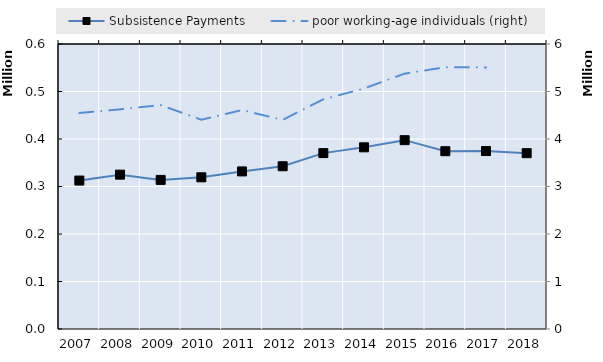
| Category | Subsistence Payments | 0 | Series 14 | Series 15 | Series 16 | Series 17 | Series 18 | Series 19 |
|---|---|---|---|---|---|---|---|---|
| 2007.0 | 312477 |  |  |  |  |  |  |  |
| 2008.0 | 324961 |  |  |  |  |  |  |  |
| 2009.0 | 313912 |  |  |  |  |  |  |  |
| 2010.0 | 319362 |  |  |  |  |  |  |  |
| 2011.0 | 331758 |  |  |  |  |  |  |  |
| 2012.0 | 342640 |  |  |  |  |  |  |  |
| 2013.0 | 370275 |  |  |  |  |  |  |  |
| 2014.0 | 382473 |  |  |  |  |  |  |  |
| 2015.0 | 397577 |  |  |  |  |  |  |  |
| 2016.0 | 374310 |  |  |  |  |  |  |  |
| 2017.0 | 374646 |  |  |  |  |  |  |  |
| 2018.0 | 370159 |  |  |  |  |  |  |  |